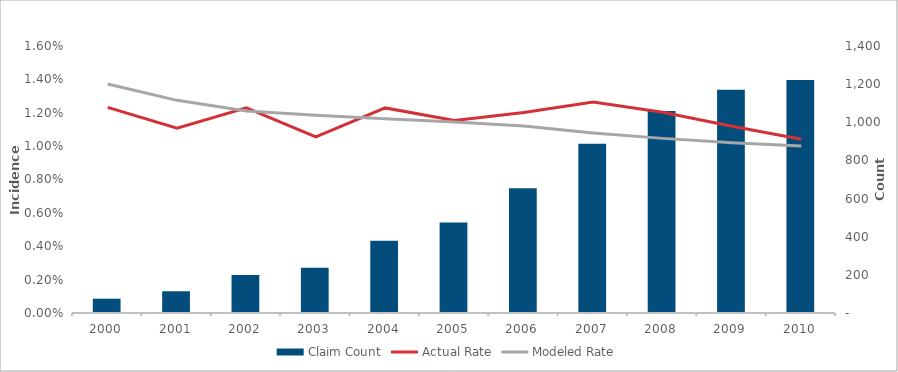
| Category | Claim Count |
|---|---|
| 2000.0 | 75 |
| 2001.0 | 114 |
| 2002.0 | 199 |
| 2003.0 | 237 |
| 2004.0 | 379 |
| 2005.0 | 474 |
| 2006.0 | 654 |
| 2007.0 | 887 |
| 2008.0 | 1059 |
| 2009.0 | 1170 |
| 2010.0 | 1222 |